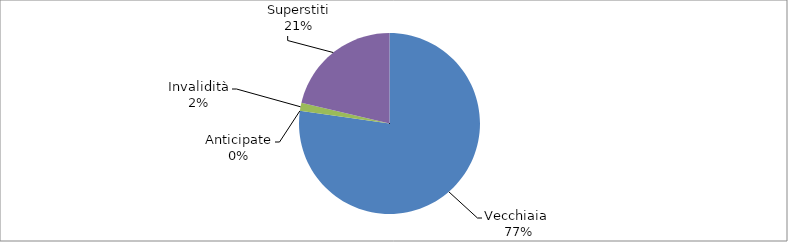
| Category | Series 0 |
|---|---|
| Vecchiaia  | 15154 |
| Anticipate | 0 |
| Invalidità | 284 |
| Superstiti | 4184 |